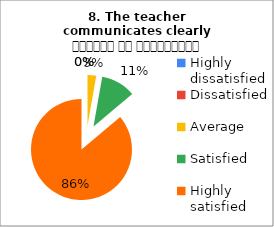
| Category | 8. The teacher communicates clearly शिक्षक का सम्प्रेषण सुस्पष्ट है |
|---|---|
| Highly dissatisfied | 0 |
| Dissatisfied | 0 |
| Average | 1 |
| Satisfied | 4 |
| Highly satisfied | 31 |